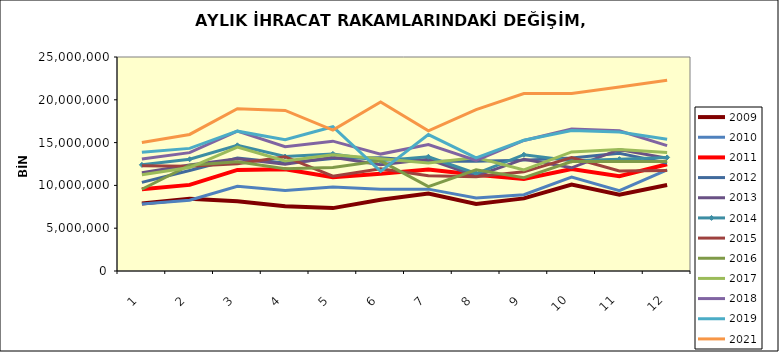
| Category | 2009 | 2010 | 2011 | 2012 | 2013 | 2014 | 2015 | 2016 | 2017 | 2018 | 2019 | 2021 |
|---|---|---|---|---|---|---|---|---|---|---|---|---|
| 0 | 7884493.524 | 7828748.058 | 9551084.639 | 10348187.166 | 11481521.079 | 12399761.948 | 12301766.75 | 9546115.4 | 11247585.677 | 13080096.762 | 13874826.012 | 15018999.72 |
| 1 | 8435115.834 | 8263237.814 | 10059126.307 | 11748000.124 | 12385690.909 | 13053292.493 | 12231860.14 | 12366388.057 | 12089908.934 | 13827132.655 | 14323043.042 | 15953297.288 |
| 2 | 8155485.081 | 9886488.171 | 11811085.16 | 13208572.977 | 13122058.141 | 14680110.78 | 12519910.438 | 12757672.093 | 14470814.059 | 16338253.918 | 16335862.397 | 18958411.299 |
| 3 | 7561696.283 | 9396006.654 | 11873269.447 | 12630226.718 | 12468202.903 | 13371185.664 | 13349346.866 | 11950497.685 | 12859938.791 | 14530822.873 | 15340619.825 | 18757788.202 |
| 4 | 7346407.528 | 9799958.117 | 10943364.372 | 13131530.961 | 13277209.017 | 13681906.159 | 11080385.127 | 12098611.067 | 13582079.731 | 15166648.044 | 16855105.097 | 16470188.529 |
| 5 | 8329692.783 | 9542907.644 | 11349953.558 | 13231198.688 | 12399973.962 | 12880924.246 | 11949647.086 | 12864154.06 | 13125306.944 | 13657091.159 | 11634653.881 | 19743448.566 |
| 6 | 9055733.671 | 9564682.545 | 11860004.271 | 12830675.307 | 13059519.685 | 13344776.958 | 11129358.974 | 9850124.872 | 12612074.056 | 14771360.698 | 15932004.724 | 16368153.333 |
| 7 | 7839908.842 | 8523451.973 | 11245124.657 | 12831394.572 | 11118300.903 | 11386828.925 | 11022045.344 | 11830762.82 | 13248462.99 | 12926754.199 | 13222876.223 | 18863383.754 |
| 8 | 8480708.387 | 8909230.521 | 10750626.099 | 12952651.722 | 13060371.039 | 13583120.906 | 11581703.842 | 10901638.452 | 11810080.805 | 15247368.846 | 15273579.961 | 20725696.625 |
| 9 | 10095768.03 | 10963586.27 | 11907219.297 | 13190769.655 | 12053704.638 | 12891630.102 | 13240039.088 | 12796159.91 | 13912699.494 | 16590652.49 | 16410781.68 | 20727972.696 |
| 10 | 8903010.773 | 9382369.718 | 11078524.743 | 13753052.493 | 14201227.351 | 13067348.107 | 11681989.013 | 12786936.247 | 14188323.116 | 16386878.393 | 16242650.391 | 21506197.967 |
| 11 | 10054591.867 | 11822551.699 | 12477486.28 | 12605476.173 | 13174857.46 | 13269271.402 | 11750818.76 | 12780523.145 | 13845665.817 | 14645696.251 | 15386718.469 | 22274138.145 |